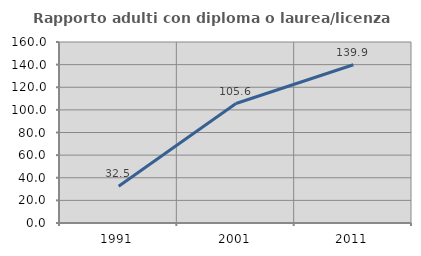
| Category | Rapporto adulti con diploma o laurea/licenza media  |
|---|---|
| 1991.0 | 32.525 |
| 2001.0 | 105.607 |
| 2011.0 | 139.895 |